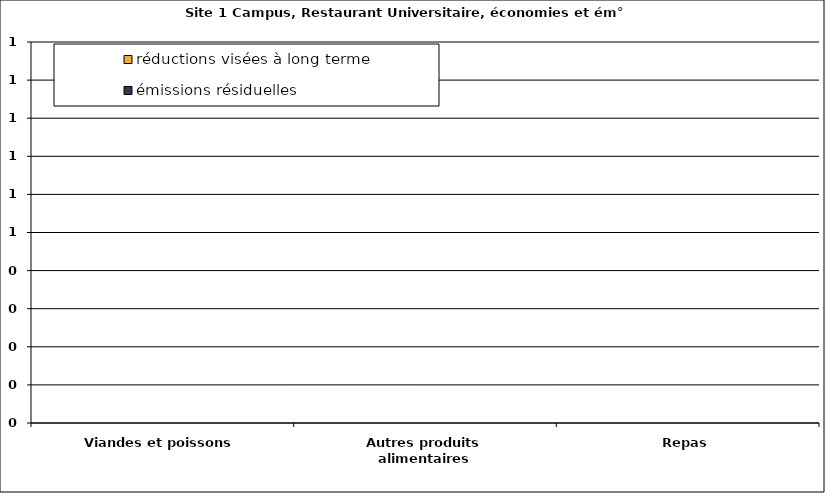
| Category | émissions résiduelles | réductions visées à long terme |
|---|---|---|
| Viandes et poissons | 0 | 0 |
| Autres produits alimentaires | 0 | 0 |
| Repas | 0 | 0 |